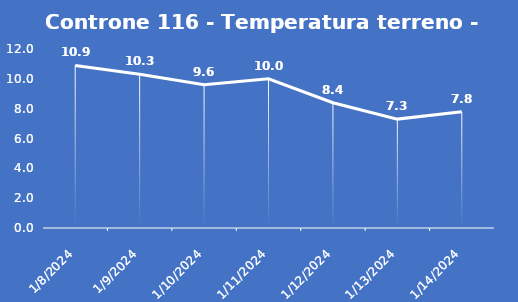
| Category | Controne 116 - Temperatura terreno - Grezzo (°C) |
|---|---|
| 1/8/24 | 10.9 |
| 1/9/24 | 10.3 |
| 1/10/24 | 9.6 |
| 1/11/24 | 10 |
| 1/12/24 | 8.4 |
| 1/13/24 | 7.3 |
| 1/14/24 | 7.8 |